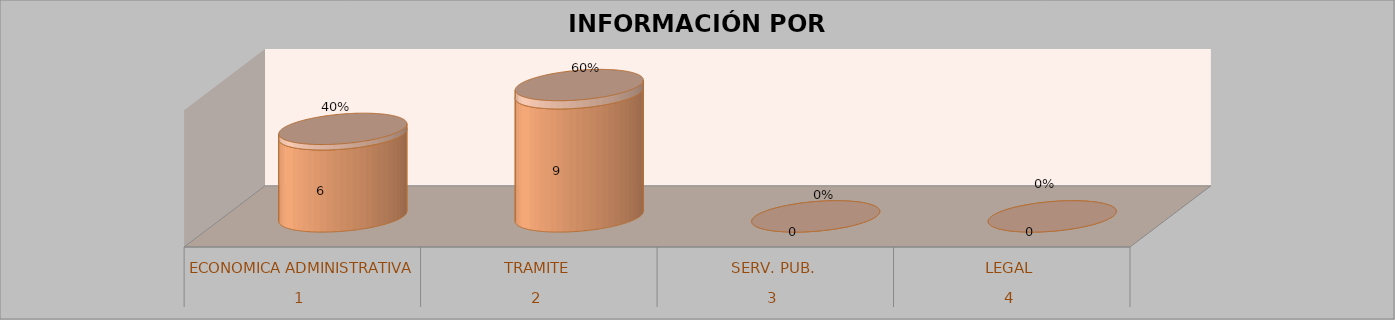
| Category | Series 0 | Series 1 | Series 2 | Series 3 |
|---|---|---|---|---|
| 0 |  |  | 6 | 0.4 |
| 1 |  |  | 9 | 0.6 |
| 2 |  |  | 0 | 0 |
| 3 |  |  | 0 | 0 |